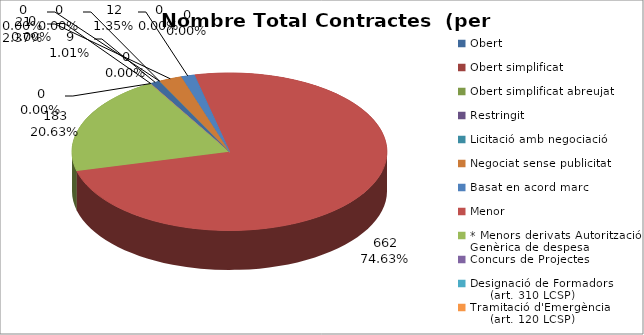
| Category | Nombre Total Contractes |
|---|---|
| Obert | 9 |
| Obert simplificat | 0 |
| Obert simplificat abreujat | 0 |
| Restringit | 0 |
| Licitació amb negociació | 0 |
| Negociat sense publicitat | 21 |
| Basat en acord marc | 12 |
| Menor | 662 |
| * Menors derivats Autorització Genèrica de despesa | 183 |
| Concurs de Projectes | 0 |
| Designació de Formadors
     (art. 310 LCSP) | 0 |
| Tramitació d'Emergència
     (art. 120 LCSP) | 0 |